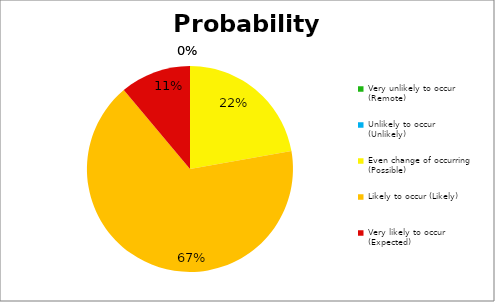
| Category | Percent |
|---|---|
| Very unlikely to occur (Remote) | 0 |
| Unlikely to occur (Unlikely) | 0 |
| Even change of occurring (Possible) | 4 |
| Likely to occur (Likely) | 12 |
| Very likely to occur (Expected) | 2 |